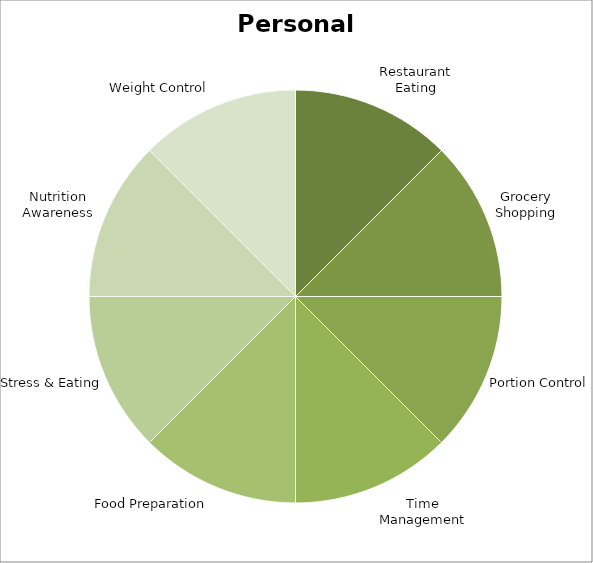
| Category | Series 0 |
|---|---|
| Restaurant Eating | 0.125 |
| Grocery Shopping | 0.125 |
| Portion Control | 0.125 |
| Time Management | 0.125 |
| Food Preparation | 0.125 |
| Stress & Eating | 0.125 |
| Nutrition Awareness | 0.125 |
| Weight Control | 0.125 |